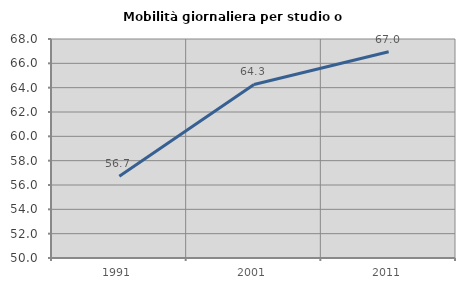
| Category | Mobilità giornaliera per studio o lavoro |
|---|---|
| 1991.0 | 56.72 |
| 2001.0 | 64.26 |
| 2011.0 | 66.952 |